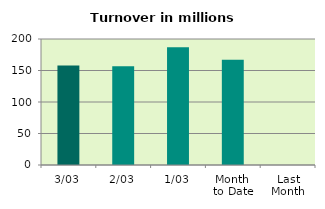
| Category | Series 0 |
|---|---|
| 3/03 | 157.761 |
| 2/03 | 156.834 |
| 1/03 | 187.1 |
| Month 
to Date | 167.232 |
| Last
Month | 0 |